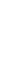
| Category | Series 0 |
|---|---|
| 0 | 1 |